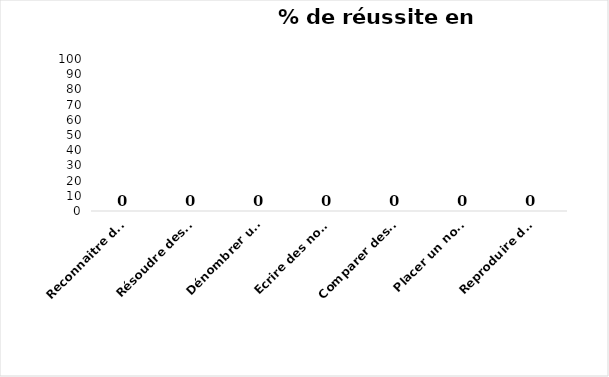
| Category | Series 0 |
|---|---|
| Reconnaitre des nombres sous la dictée | 0 |
| Résoudre des problèmes | 0 |
| Dénombrer une collection jusqu'à10 et l'associer à un chiffre | 0 |
| Ecrire des nombres sous la dictée | 0 |
| Comparer des nombres | 0 |
| Placer un nombre sur une ligne numérique | 0 |
| Reproduire des assemblages | 0 |